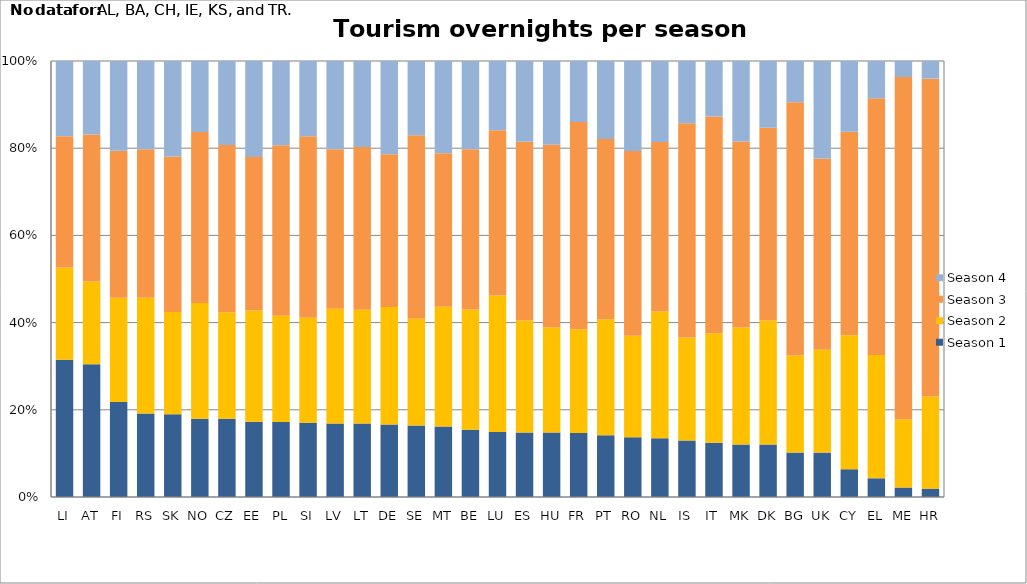
| Category | Season 1 | Season 2 | Season 3 | Season 4 |
|---|---|---|---|---|
| LI | 31.465 | 21.171 | 30.093 | 17.271 |
| AT | 30.423 | 19.019 | 33.692 | 16.867 |
| FI | 21.803 | 23.878 | 33.73 | 20.589 |
| RS | 19.152 | 26.552 | 34.073 | 20.222 |
| SK | 18.999 | 23.418 | 35.686 | 21.896 |
| NO | 17.97 | 26.514 | 39.241 | 16.274 |
| CZ | 17.941 | 24.449 | 38.335 | 19.275 |
| EE | 17.246 | 25.513 | 35.251 | 21.99 |
| PL | 17.213 | 24.376 | 39.087 | 19.324 |
| SI | 17.044 | 24.056 | 41.664 | 17.236 |
| LV | 16.878 | 26.324 | 36.58 | 20.218 |
| LT | 16.863 | 26.066 | 37.323 | 19.747 |
| DE | 16.609 | 26.956 | 35.055 | 21.38 |
| SE | 16.384 | 24.472 | 42.104 | 17.04 |
| MT | 16.172 | 27.487 | 35.204 | 21.137 |
| BE | 15.432 | 27.562 | 36.789 | 20.217 |
| LU | 14.921 | 31.324 | 37.864 | 15.892 |
| ES | 14.813 | 25.69 | 40.96 | 18.538 |
| HU | 14.794 | 24.136 | 41.834 | 19.236 |
| FR | 14.68 | 23.774 | 47.55 | 13.996 |
| PT | 14.177 | 26.604 | 41.306 | 17.912 |
| RO | 13.709 | 23.246 | 42.385 | 20.659 |
| NL | 13.486 | 29.048 | 38.894 | 18.572 |
| IS | 12.938 | 23.638 | 49.135 | 14.289 |
| IT | 12.451 | 25.114 | 49.698 | 12.737 |
| MK | 12.03 | 26.848 | 42.67 | 18.451 |
| DK | 12.026 | 28.466 | 44.188 | 15.32 |
| BG | 10.194 | 22.234 | 58.112 | 9.46 |
| UK | 10.194 | 23.561 | 43.857 | 22.388 |
| CY | 6.377 | 30.694 | 46.701 | 16.228 |
| EL | 4.29 | 28.257 | 58.883 | 8.57 |
| ME | 2.176 | 15.681 | 78.458 | 3.686 |
| HR | 1.921 | 21.135 | 72.894 | 4.051 |